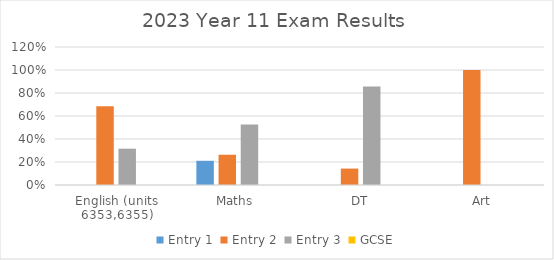
| Category | Entry 1 | Entry 2 | Entry 3 | GCSE |
|---|---|---|---|---|
| English (units 6353,6355) | 0 | 0.684 | 0.316 | 0 |
| Maths  | 0.211 | 0.263 | 0.526 | 0 |
| DT | 0 | 0.143 | 0.857 | 0 |
| Art | 0 | 1 | 0 | 0 |